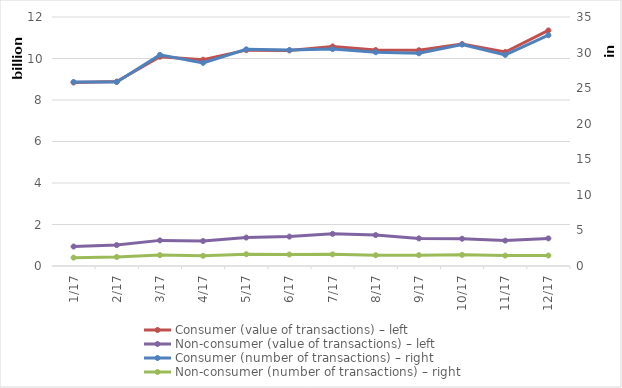
| Category | Consumer (value of transactions) – left | Non-consumer (value of transactions) – left |
|---|---|---|
| 2017-01-01 | 8842959516 | 938256877 |
| 2017-02-01 | 8887711190 | 1007299830 |
| 2017-03-01 | 10084523616 | 1234777955 |
| 2017-04-01 | 9941691125 | 1203485381 |
| 2017-05-01 | 10403020408 | 1370903368 |
| 2017-06-01 | 10389394856 | 1416565230 |
| 2017-07-01 | 10580496534 | 1550529697 |
| 2017-08-01 | 10406670699 | 1489649692 |
| 2017-09-01 | 10397889395 | 1330963627 |
| 2017-10-01 | 10695721761 | 1313449459 |
| 2017-11-01 | 10311215415 | 1223451447 |
| 2017-12-01 | 11353483792 | 1330583558 |